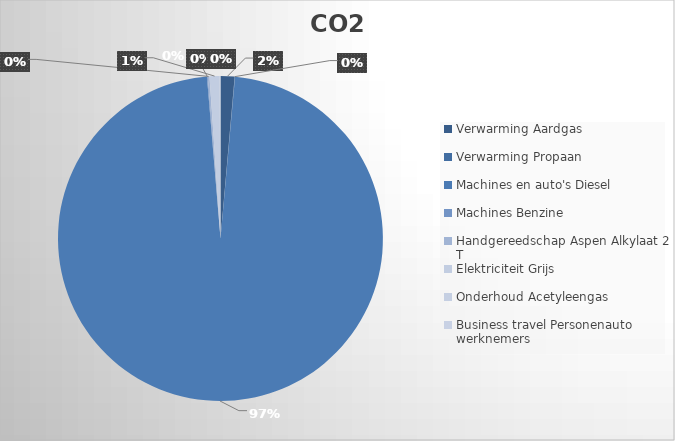
| Category | Ton CO2 | Series 1 |
|---|---|---|
| 0 | 12.041 |  |
| 1 | 0.308 |  |
| 2 | 840.816 |  |
| 3 | 0.69 |  |
| 4 | 1.503 |  |
| 5 | 8.57 |  |
| 6 | 0.748 |  |
| 7 | 0 |  |